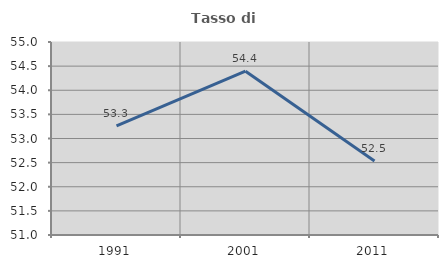
| Category | Tasso di occupazione   |
|---|---|
| 1991.0 | 53.261 |
| 2001.0 | 54.396 |
| 2011.0 | 52.532 |